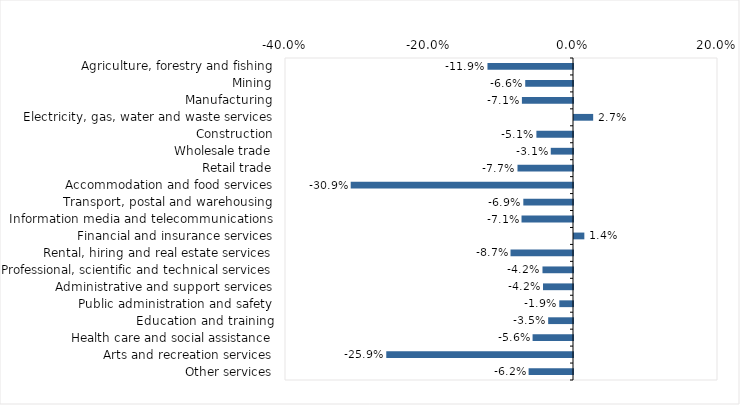
| Category | This week |
|---|---|
| Agriculture, forestry and fishing | -0.119 |
| Mining | -0.066 |
| Manufacturing | -0.071 |
| Electricity, gas, water and waste services | 0.027 |
| Construction | -0.051 |
| Wholesale trade | -0.031 |
| Retail trade | -0.077 |
| Accommodation and food services | -0.309 |
| Transport, postal and warehousing | -0.069 |
| Information media and telecommunications | -0.071 |
| Financial and insurance services | 0.014 |
| Rental, hiring and real estate services | -0.087 |
| Professional, scientific and technical services | -0.042 |
| Administrative and support services | -0.042 |
| Public administration and safety | -0.019 |
| Education and training | -0.035 |
| Health care and social assistance | -0.056 |
| Arts and recreation services | -0.259 |
| Other services | -0.062 |